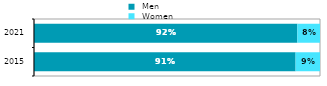
| Category |  Men |  Women |
|---|---|---|
| 2015.0 | 0.915 | 0.085 |
| 2021.0 | 0.921 | 0.079 |